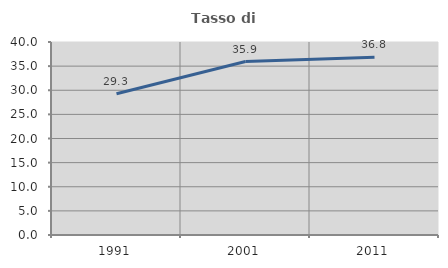
| Category | Tasso di occupazione   |
|---|---|
| 1991.0 | 29.286 |
| 2001.0 | 35.946 |
| 2011.0 | 36.842 |